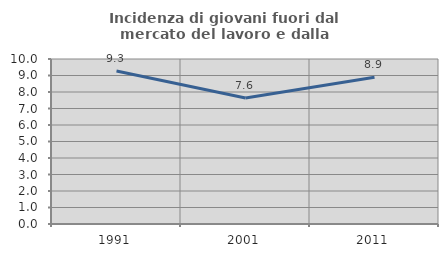
| Category | Incidenza di giovani fuori dal mercato del lavoro e dalla formazione  |
|---|---|
| 1991.0 | 9.272 |
| 2001.0 | 7.634 |
| 2011.0 | 8.889 |